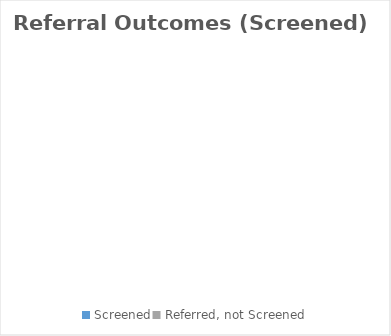
| Category | Series 0 |
|---|---|
| Screened | 0 |
| Referred, not Screened | 0 |